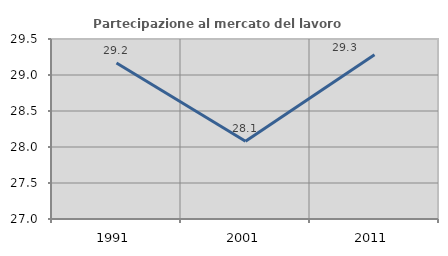
| Category | Partecipazione al mercato del lavoro  femminile |
|---|---|
| 1991.0 | 29.167 |
| 2001.0 | 28.079 |
| 2011.0 | 29.28 |